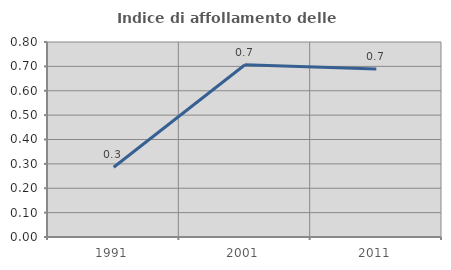
| Category | Indice di affollamento delle abitazioni  |
|---|---|
| 1991.0 | 0.286 |
| 2001.0 | 0.707 |
| 2011.0 | 0.69 |